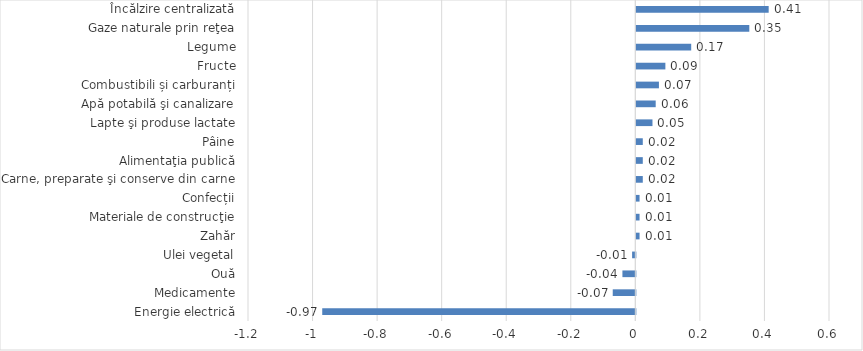
| Category | Series 0 |
|---|---|
|   Energie electrică | -0.97 |
| Medicamente | -0.07 |
| Ouă | -0.04 |
| Ulei vegetal | -0.01 |
| Zahăr | 0.01 |
| Materiale de construcţie | 0.01 |
| Confecții | 0.01 |
| Carne, preparate şi conserve din carne | 0.02 |
| Alimentaţia publică | 0.02 |
| Pâine | 0.02 |
| Lapte şi produse lactate | 0.05 |
|   Apă potabilă şi canalizare | 0.06 |
| Combustibili și carburanți | 0.07 |
| Fructe | 0.09 |
| Legume | 0.17 |
|   Gaze naturale prin reţea | 0.35 |
|   Încălzire centralizată | 0.41 |